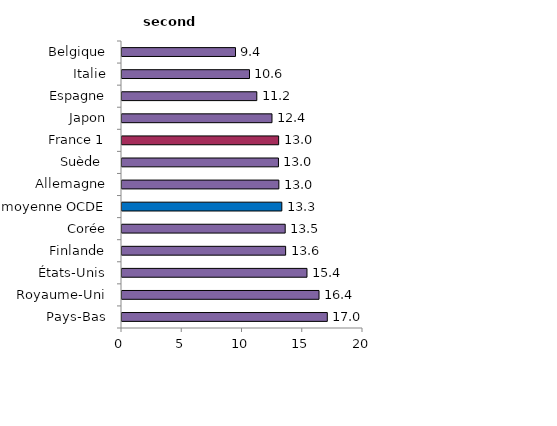
| Category | enseignement second degré |
|---|---|
| Pays-Bas | 17.037 |
| Royaume-Uni | 16.35 |
| États-Unis | 15.35 |
| Finlande | 13.58 |
| Corée | 13.544 |
| moyenne OCDE | 13.264 |
| Allemagne | 13.017 |
| Suède  | 12.984 |
| France 1 | 13 |
| Japon | 12.447 |
| Espagne | 11.187 |
| Italie | 10.58 |
| Belgique | 9.419 |